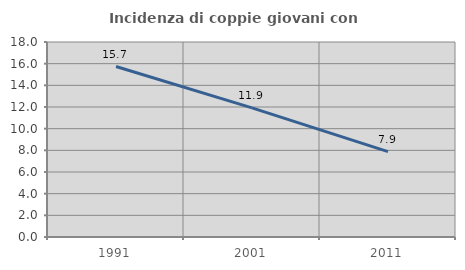
| Category | Incidenza di coppie giovani con figli |
|---|---|
| 1991.0 | 15.736 |
| 2001.0 | 11.919 |
| 2011.0 | 7.884 |